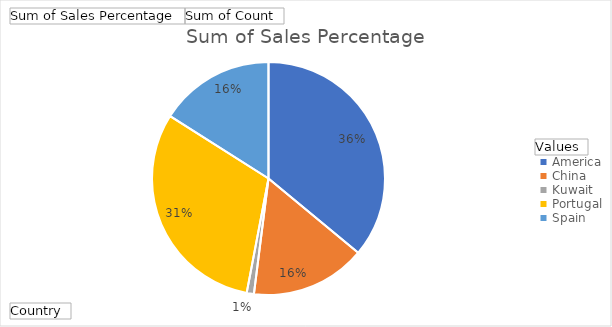
| Category | Sum of Sales Percentage | Sum of Count |
|---|---|---|
| America | 0.36 | 2 |
| China | 0.16 | 2 |
| Kuwait | 0.01 | 1 |
| Portugal | 0.31 | 2 |
| Spain | 0.16 | 1 |